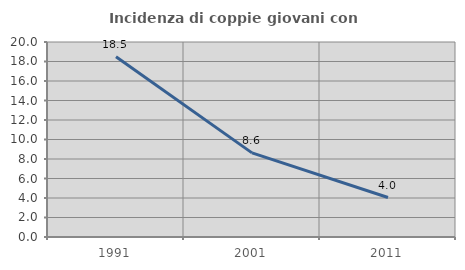
| Category | Incidenza di coppie giovani con figli |
|---|---|
| 1991.0 | 18.496 |
| 2001.0 | 8.63 |
| 2011.0 | 4.048 |